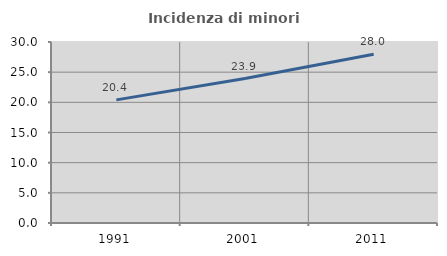
| Category | Incidenza di minori stranieri |
|---|---|
| 1991.0 | 20.408 |
| 2001.0 | 23.936 |
| 2011.0 | 27.961 |